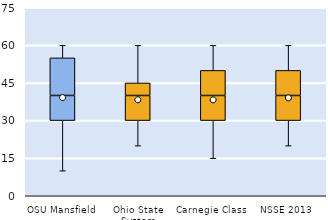
| Category | 25th | 50th | 75th |
|---|---|---|---|
| OSU Mansfield | 30 | 10 | 15 |
| Ohio State System | 30 | 10 | 5 |
| Carnegie Class | 30 | 10 | 10 |
| NSSE 2013 | 30 | 10 | 10 |